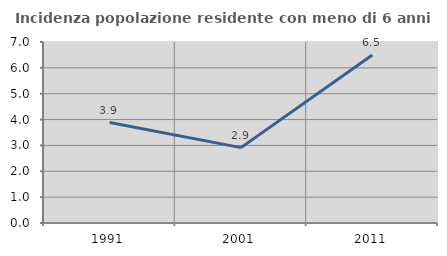
| Category | Incidenza popolazione residente con meno di 6 anni |
|---|---|
| 1991.0 | 3.885 |
| 2001.0 | 2.915 |
| 2011.0 | 6.501 |